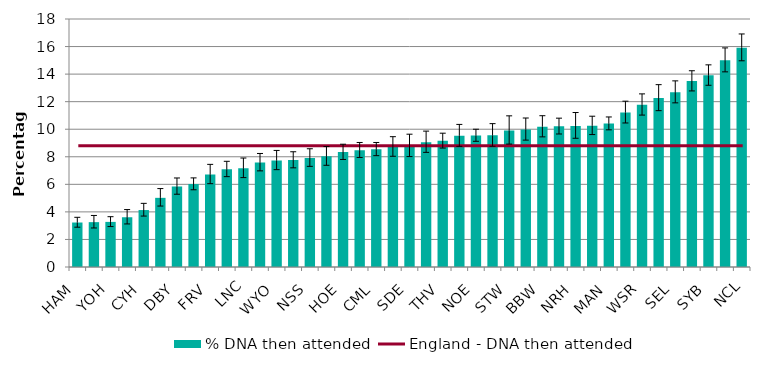
| Category | % DNA then attended |
|---|---|
| HAM | 3.229 |
| LEI | 3.256 |
| YOH | 3.274 |
| COV | 3.611 |
| CYH | 4.134 |
| BCO | 5.02 |
| DBY | 5.844 |
| CHM | 6.022 |
| FRV | 6.714 |
| ESX | 7.095 |
| LNC | 7.167 |
| NOR | 7.584 |
| WYO | 7.735 |
| DOW | 7.761 |
| NSS | 7.92 |
| CAM | 8.036 |
| HOE | 8.341 |
| WSU | 8.479 |
| CML | 8.547 |
| PEN | 8.722 |
| SDE | 8.793 |
| GLO | 9.062 |
| THV | 9.158 |
| HRW | 9.525 |
| NOE | 9.553 |
| SOM | 9.554 |
| STW | 9.899 |
| NOT | 9.983 |
| BBW | 10.188 |
| KEN | 10.213 |
| NRH | 10.24 |
| SWL | 10.259 |
| MAN | 10.413 |
| HFD | 11.22 |
| WSR | 11.773 |
| BLM | 12.26 |
| SEL | 12.691 |
| NWL | 13.495 |
| SYB | 13.914 |
| NEL | 15.012 |
| NCL | 15.917 |